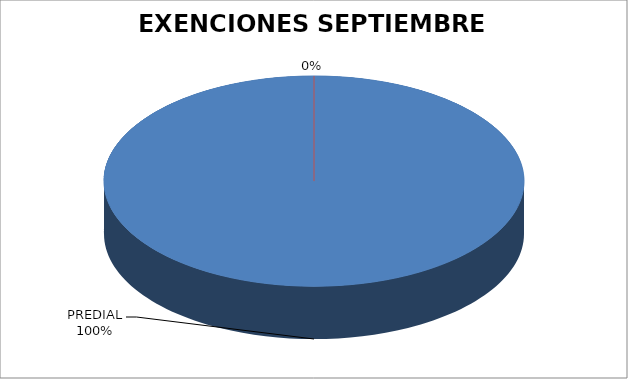
| Category | Series 0 |
|---|---|
| PREDIAL | 14 |